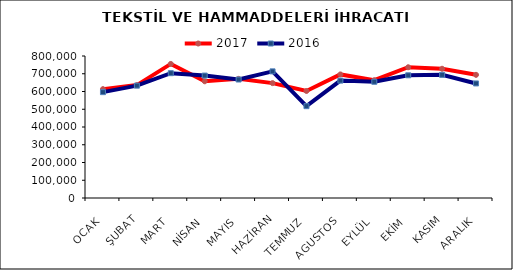
| Category | 2017 | 2016 |
|---|---|---|
| OCAK | 613393.967 | 596331.438 |
| ŞUBAT | 636040.205 | 632879.718 |
| MART | 755364.58 | 703175.957 |
| NİSAN | 657579.972 | 689660.143 |
| MAYIS | 671159.997 | 667505.872 |
| HAZİRAN | 647108.178 | 713413.894 |
| TEMMUZ | 602992.547 | 517401.237 |
| AGUSTOS | 696171.324 | 661290.122 |
| EYLÜL | 663497.027 | 654791.12 |
| EKİM | 736644.855 | 691260.251 |
| KASIM | 728007.31 | 693725 |
| ARALIK | 693860.911 | 645375.496 |